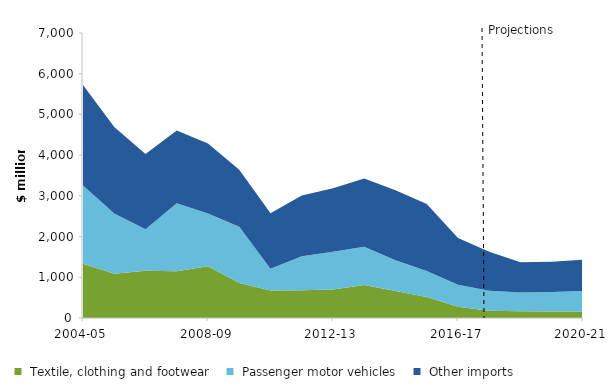
| Category |  Textile, clothing and footwear |  Passenger motor vehicles |  Other imports |
|---|---|---|---|
| 2004-05 | 1330.335 | 1923.89 | 2469.244 |
| 2005-06 | 1089.374 | 1478.249 | 2121.136 |
| 2006-07 | 1158.046 | 1022.025 | 1849.379 |
| 2007-08 | 1145.593 | 1670.656 | 1786.409 |
| 2008-09 | 1273.509 | 1290.565 | 1724.922 |
| 2009-10 | 861.732 | 1377.424 | 1402.141 |
| 2010-11 | 675.477 | 535.942 | 1360.468 |
| 2011-12 | 679.915 | 835.621 | 1494.775 |
| 2012-13 | 702.417 | 926.858 | 1557.578 |
| 2013-14 | 808.491 | 943.752 | 1671.292 |
| 2014-15 | 665.537 | 755.307 | 1716.983 |
| 2015-16 | 516.426 | 636.718 | 1647.793 |
| 2016-17 | 279 | 540 | 1148 |
| 2017-18 | 176.481 | 490.226 | 960.844 |
| 2018-19 | 163.009 | 460.261 | 747.925 |
| 2019-20 | 159.033 | 477.1 | 748.392 |
| 2020-21 | 155.155 | 511.097 | 766.646 |